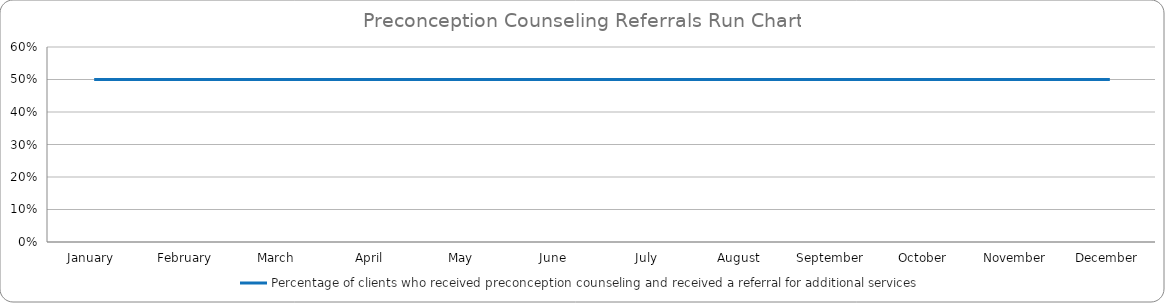
| Category | Percentage of clients who received preconception counseling and received a referral for additional services |
|---|---|
| January  | 0.5 |
| February | 0.5 |
| March | 0.5 |
| April | 0.5 |
| May | 0.5 |
| June | 0.5 |
| July | 0.5 |
| August | 0.5 |
| September | 0.5 |
| October | 0.5 |
| November | 0.5 |
| December | 0.5 |